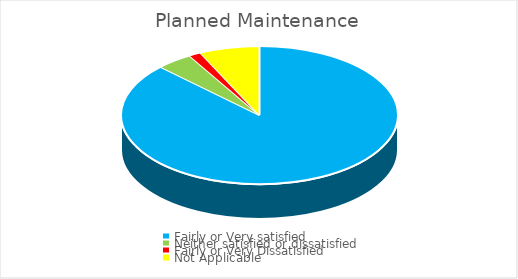
| Category | Series 0 |
|---|---|
| Fairly or Very satisfied | 87.32 |
| Neither satisfied or dissatisfied | 4.23 |
| Fairly or Very Dissatisfied | 1.41 |
| Not Applicable | 7.04 |